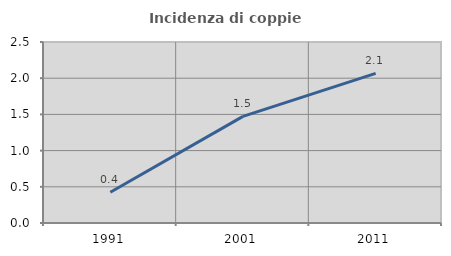
| Category | Incidenza di coppie miste |
|---|---|
| 1991.0 | 0.426 |
| 2001.0 | 1.472 |
| 2011.0 | 2.067 |